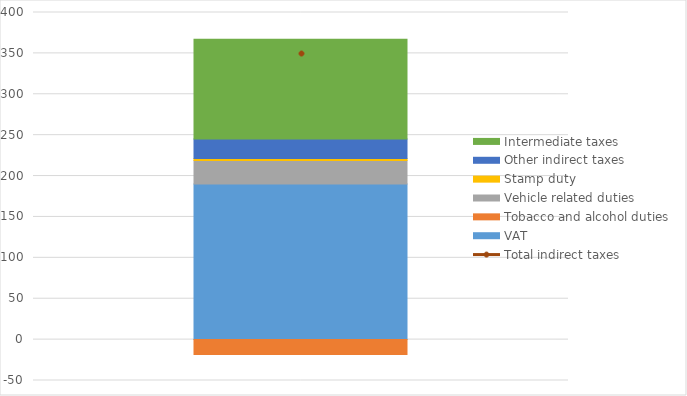
| Category | VAT | Tobacco and alcohol duties | Vehicle related duties | Stamp duty | Other indirect taxes | Intermediate taxes  |
|---|---|---|---|---|---|---|
| Change in average | 190.3 | -18.2 | 28.6 | 2.7 | 23.7 | 122.1 |